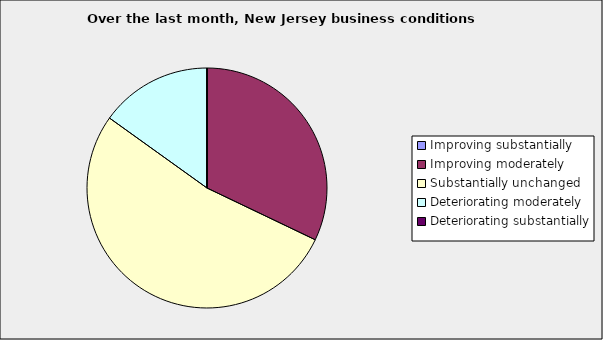
| Category | Series 0 |
|---|---|
| Improving substantially | 0 |
| Improving moderately | 0.321 |
| Substantially unchanged | 0.528 |
| Deteriorating moderately | 0.151 |
| Deteriorating substantially | 0 |